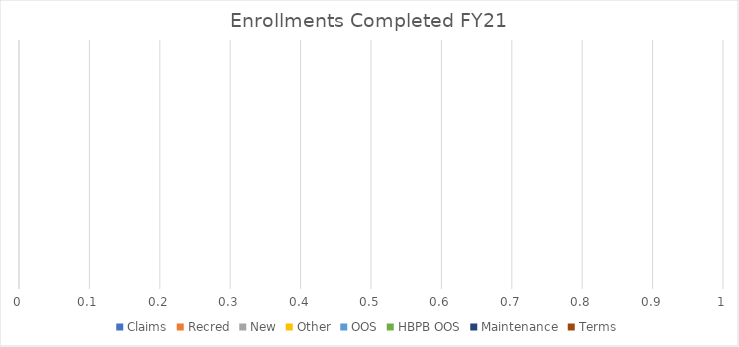
| Category | Claims | Recred | New | Other | OOS | HBPB OOS | Maintenance | Terms |
|---|---|---|---|---|---|---|---|---|
|  | 0 | 0 | 0 | 0 | 0 | 0 | 0 | 0 |
|  | 0 | 0 | 0 | 0 | 0 | 0 | 0 | 0 |
|  | 0 | 0 | 0 | 0 | 0 | 0 | 0 | 0 |
|  | 0 | 0 | 0 | 0 | 0 | 0 | 0 | 0 |